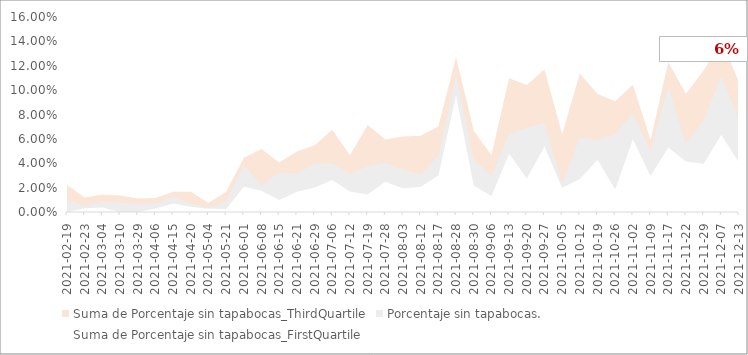
| Category | Suma de Porcentaje sin tapabocas_ThirdQuartile | Porcentaje sin tapabocas. | Suma de Porcentaje sin tapabocas_FirstQuartile |
|---|---|---|---|
| 2021-02-19 | 0.022 | 0.01 | 0 |
| 2021-02-23 | 0.012 | 0.005 | 0.003 |
| 2021-03-04 | 0.014 | 0.009 | 0.004 |
| 2021-03-10 | 0.014 | 0.008 | 0 |
| 2021-03-29 | 0.011 | 0.007 | 0 |
| 2021-04-06 | 0.011 | 0.007 | 0.003 |
| 2021-04-15 | 0.017 | 0.013 | 0.007 |
| 2021-04-20 | 0.017 | 0.007 | 0.004 |
| 2021-05-04 | 0.007 | 0.004 | 0.003 |
| 2021-05-21 | 0.017 | 0.009 | 0.002 |
| 2021-06-01 | 0.044 | 0.038 | 0.021 |
| 2021-06-08 | 0.052 | 0.022 | 0.017 |
| 2021-06-15 | 0.041 | 0.033 | 0.01 |
| 2021-06-21 | 0.05 | 0.032 | 0.017 |
| 2021-06-29 | 0.055 | 0.04 | 0.02 |
| 2021-07-06 | 0.068 | 0.04 | 0.026 |
| 2021-07-12 | 0.047 | 0.031 | 0.017 |
| 2021-07-19 | 0.071 | 0.038 | 0.014 |
| 2021-07-28 | 0.059 | 0.04 | 0.025 |
| 2021-08-03 | 0.062 | 0.035 | 0.02 |
| 2021-08-12 | 0.062 | 0.031 | 0.021 |
| 2021-08-17 | 0.07 | 0.046 | 0.03 |
| 2021-08-28 | 0.127 | 0.112 | 0.096 |
| 2021-08-30 | 0.067 | 0.044 | 0.022 |
| 2021-09-06 | 0.047 | 0.03 | 0.013 |
| 2021-09-13 | 0.11 | 0.064 | 0.048 |
| 2021-09-20 | 0.104 | 0.069 | 0.028 |
| 2021-09-27 | 0.117 | 0.073 | 0.054 |
| 2021-10-05 | 0.064 | 0.023 | 0.02 |
| 2021-10-12 | 0.114 | 0.061 | 0.027 |
| 2021-10-19 | 0.097 | 0.059 | 0.043 |
| 2021-10-26 | 0.091 | 0.064 | 0.019 |
| 2021-11-02 | 0.104 | 0.081 | 0.06 |
| 2021-11-09 | 0.059 | 0.05 | 0.03 |
| 2021-11-17 | 0.123 | 0.103 | 0.053 |
| 2021-11-22 | 0.097 | 0.056 | 0.041 |
| 2021-11-29 | 0.116 | 0.075 | 0.04 |
| 2021-12-07 | 0.141 | 0.112 | 0.063 |
| 2021-12-13 | 0.107 | 0.076 | 0.04 |